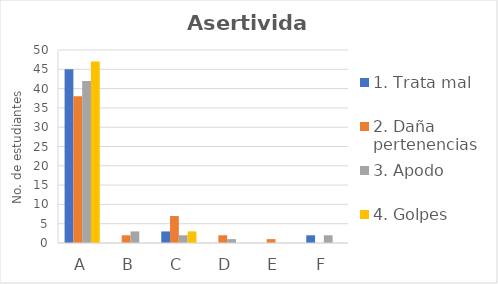
| Category | 1. Trata mal | 2. Daña pertenencias | 3. Apodo | 4. Golpes |
|---|---|---|---|---|
| a | 45 | 38 | 42 | 47 |
| b | 0 | 2 | 3 | 0 |
| c | 3 | 7 | 2 | 3 |
| d | 0 | 2 | 1 | 0 |
| e | 0 | 1 | 0 | 0 |
| f | 2 | 0 | 2 | 0 |